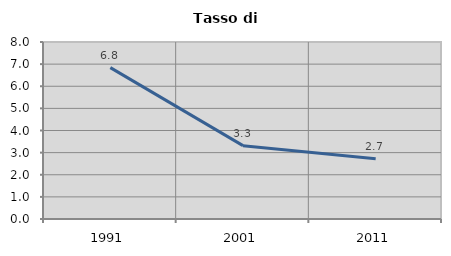
| Category | Tasso di disoccupazione   |
|---|---|
| 1991.0 | 6.842 |
| 2001.0 | 3.315 |
| 2011.0 | 2.721 |